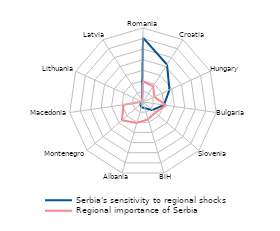
| Category | Serbia's sensitivity to regional shocks | Regional importance of Serbia |
|---|---|---|
| Romania | 0.304 | 0.097 |
| Croatia | 0.21 | 0.089 |
| Hungary | 0.138 | 0.059 |
| Bulgaria | 0.1 | 0.111 |
| Slovenia | 0.058 | 0.076 |
| BiH | 0.03 | 0.086 |
| Albania | 0.026 | 0.103 |
| Montenegro | 0.017 | 0.132 |
| Macedonia | 0.005 | 0.093 |
| Lithuania | 0.004 | 0.004 |
| Latvia | 0.002 | 0.002 |